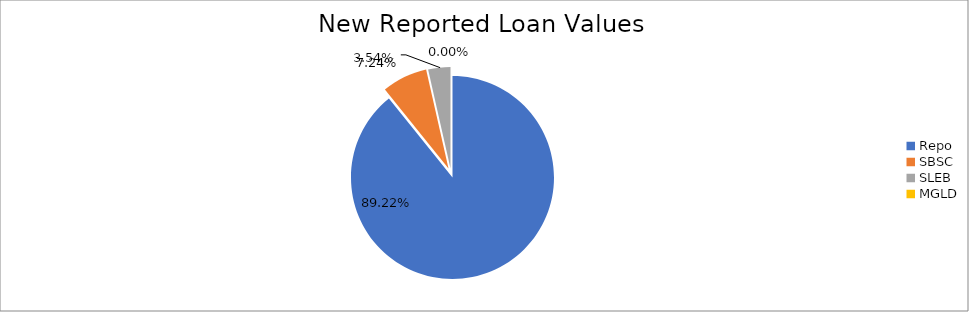
| Category | Series 0 |
|---|---|
| Repo | 11718467.782 |
| SBSC | 950747.119 |
| SLEB | 464799.121 |
| MGLD | 135.943 |